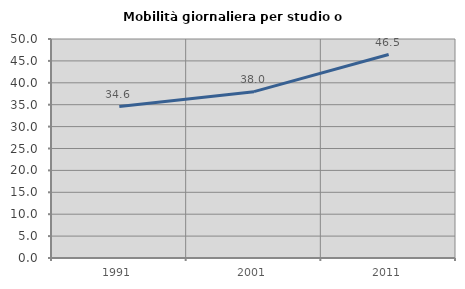
| Category | Mobilità giornaliera per studio o lavoro |
|---|---|
| 1991.0 | 34.568 |
| 2001.0 | 37.981 |
| 2011.0 | 46.458 |